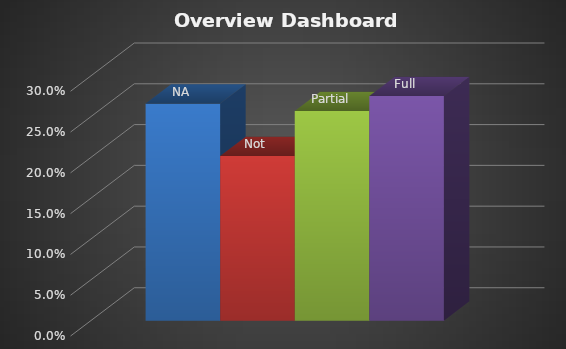
| Category | Series 0 | Series 1 | Series 2 | Series 3 |
|---|---|---|---|---|
| 0 | 0.266 | 0.202 | 0.257 | 0.275 |